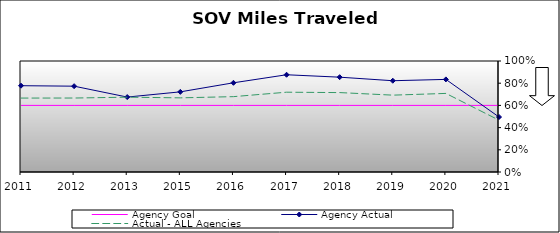
| Category | Agency Goal | Agency Actual | Actual - ALL Agencies |
|---|---|---|---|
| 2011.0 | 0.6 | 0.778 | 0.666 |
| 2012.0 | 0.6 | 0.773 | 0.666 |
| 2013.0 | 0.6 | 0.675 | 0.674 |
| 2015.0 | 0.6 | 0.722 | 0.668 |
| 2016.0 | 0.6 | 0.804 | 0.679 |
| 2017.0 | 0.6 | 0.876 | 0.719 |
| 2018.0 | 0.6 | 0.854 | 0.715 |
| 2019.0 | 0.6 | 0.822 | 0.692 |
| 2020.0 | 0.6 | 0.834 | 0.708 |
| 2021.0 | 0.6 | 0.495 | 0.467 |